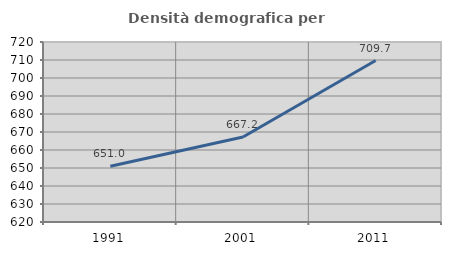
| Category | Densità demografica |
|---|---|
| 1991.0 | 650.981 |
| 2001.0 | 667.244 |
| 2011.0 | 709.714 |